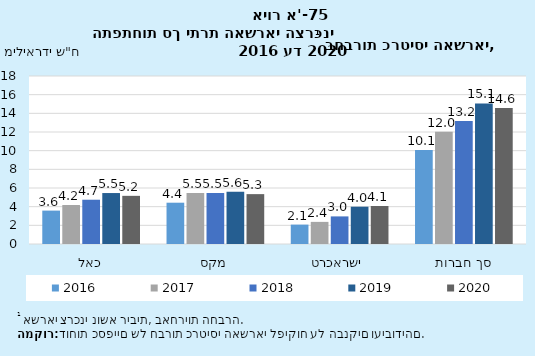
| Category | 2016 | 2017 | 2018 | 2019 | 2020 |
|---|---|---|---|---|---|
| כאל | 3.578 | 4.176 | 4.744 | 5.46 | 5.159 |
| מקס | 4.425 | 5.469 | 5.477 | 5.6 | 5.344 |
| ישראכרט | 2.078 | 2.37 | 2.957 | 3.997 | 4.07 |
| סך חברות כרטיסי האשראי | 10.081 | 12.015 | 13.178 | 15.057 | 14.573 |